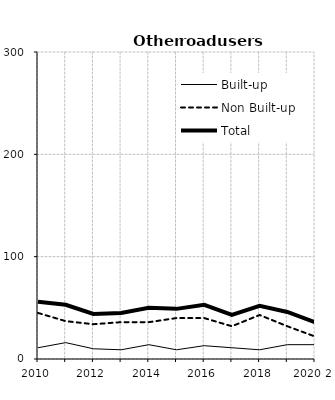
| Category | Built-up | Non Built-up | Total |
|---|---|---|---|
| 2010 | 11 | 45 | 56 |
| 2011 | 16 | 37 | 53 |
| 2012 | 10 | 34 | 44 |
| 2013 | 9 | 36 | 45 |
| 2014 | 14 | 36 | 50 |
| 2015 | 9 | 40 | 49 |
| 2016 | 13 | 40 | 53 |
| 2017 | 11 | 32 | 43 |
| 2018 | 9 | 43 | 52 |
| 2019 2 | 14 | 32 | 46 |
| 2020 2 | 14 | 22 | 36 |